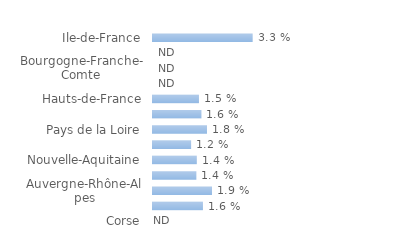
| Category | Series 0 |
|---|---|
| Ile-de-France | 0.033 |
| Centre-Val de Loire | 0 |
| Bourgogne-Franche-Comte | 0 |
| Normandie | 0 |
| Hauts-de-France | 0.015 |
| Grand Est | 0.016 |
| Pays de la Loire | 0.018 |
| Bretagne | 0.012 |
| Nouvelle-Aquitaine | 0.014 |
| Occitanie | 0.014 |
| Auvergne-Rhône-Alpes | 0.019 |
| Provence-Alpes-Côte d'Azur | 0.016 |
| Corse | 0 |